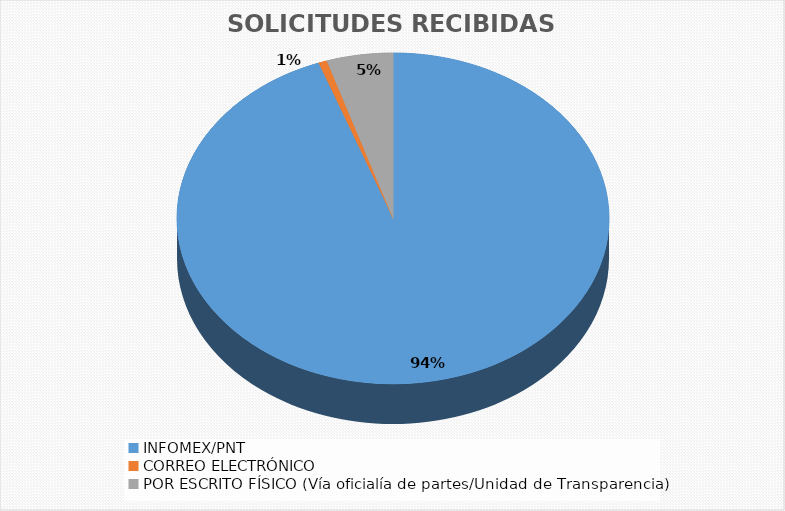
| Category | Series 0 |
|---|---|
| INFOMEX/PNT | 2244 |
| CORREO ELECTRÓNICO | 15 |
| POR ESCRITO FÍSICO (Vía oficialía de partes/Unidad de Transparencia) | 118 |